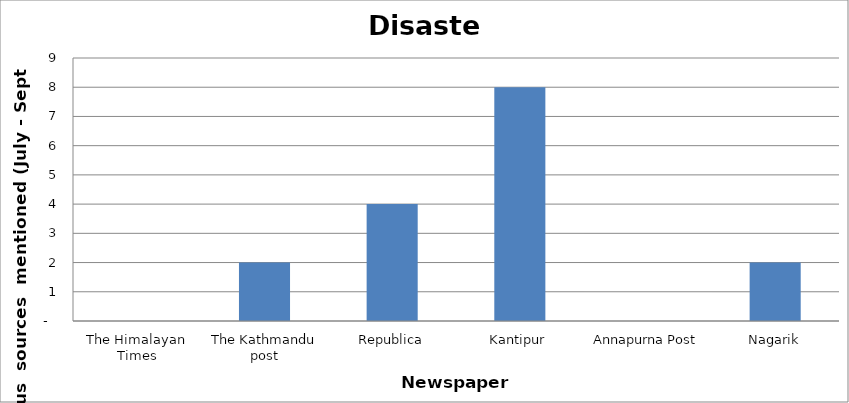
| Category | Disaster |
|---|---|
| The Himalayan Times | 0 |
| The Kathmandu post | 2 |
| Republica | 4 |
| Kantipur | 8 |
| Annapurna Post | 0 |
| Nagarik | 2 |